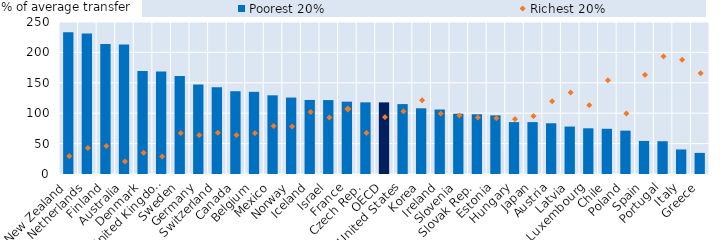
| Category | Poorest 20% |
|---|---|
| New Zealand | 232.957 |
| Netherlands | 230.952 |
| Finland | 213.87 |
| Australia | 213.175 |
| Denmark | 169.313 |
| United Kingdom | 168.771 |
| Sweden | 161.372 |
| Germany | 147.13 |
| Switzerland | 142.509 |
| Canada | 136.15 |
| Belgium | 135.124 |
| Mexico | 129.39 |
| Norway | 125.742 |
| Iceland | 121.78 |
| Israel | 121.6 |
| France | 119 |
| Czech Rep. | 117.828 |
| OECD | 117.802 |
| United States | 115.001 |
| Korea | 108.059 |
| Ireland | 106.085 |
| Slovenia | 99.186 |
| Slovak Rep. | 98.262 |
| Estonia | 96.422 |
| Hungary | 85.352 |
| Japan | 85.338 |
| Austria | 83.444 |
| Latvia | 78.043 |
| Luxembourg | 75.154 |
| Chile | 74.371 |
| Poland | 71.311 |
| Spain | 54.355 |
| Portugal | 53.889 |
| Italy | 40.34 |
| Greece | 34.717 |